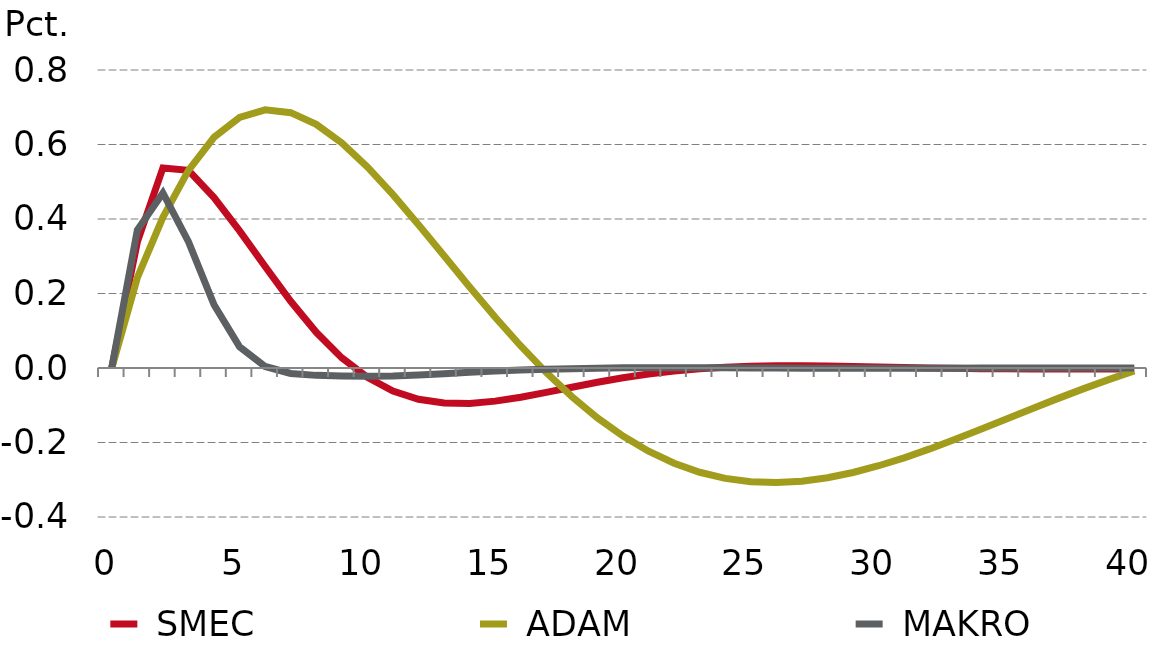
| Category |  SMEC |  ADAM |  MAKRO |
|---|---|---|---|
| 0.0 | 0 | 0 | 0 |
| nan | 0.338 | 0.242 | 0.37 |
| nan | 0.537 | 0.405 | 0.47 |
| nan | 0.531 | 0.53 | 0.339 |
| nan | 0.458 | 0.619 | 0.17 |
| 5.0 | 0.368 | 0.673 | 0.057 |
| nan | 0.272 | 0.693 | 0.004 |
| nan | 0.179 | 0.685 | -0.015 |
| nan | 0.096 | 0.654 | -0.02 |
| nan | 0.027 | 0.604 | -0.022 |
| 10.0 | -0.025 | 0.54 | -0.022 |
| nan | -0.062 | 0.465 | -0.021 |
| nan | -0.084 | 0.385 | -0.019 |
| nan | -0.094 | 0.301 | -0.015 |
| nan | -0.095 | 0.218 | -0.011 |
| 15.0 | -0.089 | 0.136 | -0.008 |
| nan | -0.078 | 0.059 | -0.005 |
| nan | -0.065 | -0.012 | -0.003 |
| nan | -0.052 | -0.077 | -0.002 |
| nan | -0.038 | -0.134 | 0 |
| 20.0 | -0.026 | -0.183 | 0 |
| nan | -0.016 | -0.223 | 0.001 |
| nan | -0.008 | -0.256 | 0.001 |
| nan | -0.002 | -0.28 | 0.001 |
| nan | 0.002 | -0.296 | 0.001 |
| 25.0 | 0.005 | -0.305 | 0 |
| nan | 0.006 | -0.308 | 0 |
| nan | 0.006 | -0.304 | 0 |
| nan | 0.005 | -0.295 | -0.001 |
| nan | 0.004 | -0.28 | 0 |
| 30.0 | 0.003 | -0.262 | 0 |
| nan | 0.001 | -0.241 | -0.001 |
| nan | 0 | -0.217 | 0 |
| nan | -0.001 | -0.191 | 0 |
| nan | -0.002 | -0.165 | 0 |
| 35.0 | -0.002 | -0.137 | 0 |
| nan | -0.003 | -0.109 | 0 |
| nan | -0.003 | -0.082 | 0 |
| nan | -0.003 | -0.056 | 0 |
| nan | -0.003 | -0.031 | 0 |
| 40.0 | -0.003 | -0.008 | 0 |